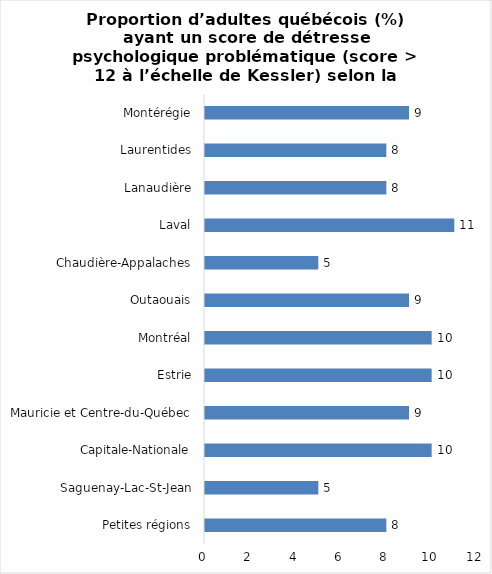
| Category | Series 0 |
|---|---|
| Petites régions | 8 |
| Saguenay-Lac-St-Jean | 5 |
| Capitale-Nationale | 10 |
| Mauricie et Centre-du-Québec | 9 |
| Estrie | 10 |
| Montréal | 10 |
| Outaouais | 9 |
| Chaudière-Appalaches | 5 |
| Laval | 11 |
| Lanaudière | 8 |
| Laurentides | 8 |
| Montérégie | 9 |